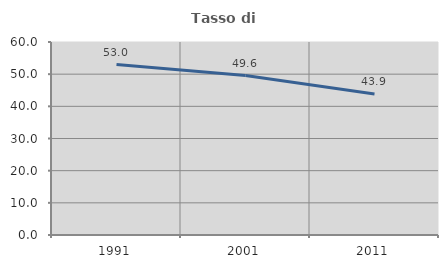
| Category | Tasso di occupazione   |
|---|---|
| 1991.0 | 53.004 |
| 2001.0 | 49.583 |
| 2011.0 | 43.852 |